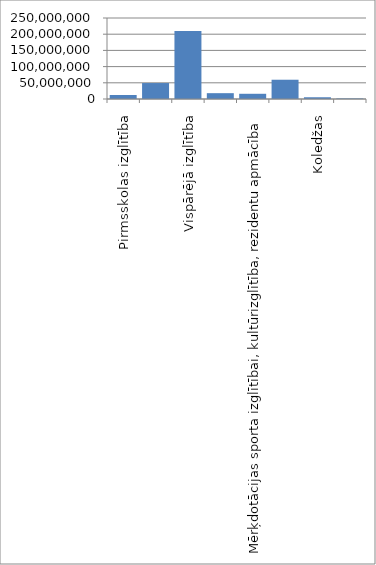
| Category | Series 0 |
|---|---|
| Pirmsskolas izglītība | 12324000 |
| Profesionālā izglītība | 49250120 |
| Vispārējā izglītība | 209961038 |
| Zinātniskās darbības nodrošināšana, pētījumu programmas, mežu resursu izpēte | 17987876 |
| Mērķdotācijas sporta izglītībai, kultūrizglītība, rezidentu apmācība | 16109204 |
| Augstākā izglītība | 59483254 |
| Koledžas | 5394240 |
| Starptautiskā sadarbība, jaunatnes politika, mācību satura pilnveide, dotācijas | 1632972 |